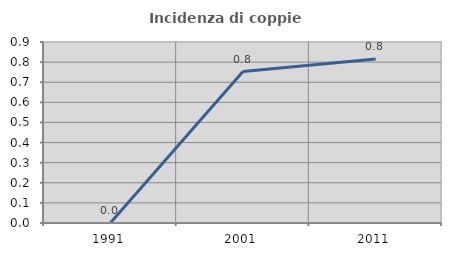
| Category | Incidenza di coppie miste |
|---|---|
| 1991.0 | 0 |
| 2001.0 | 0.753 |
| 2011.0 | 0.815 |